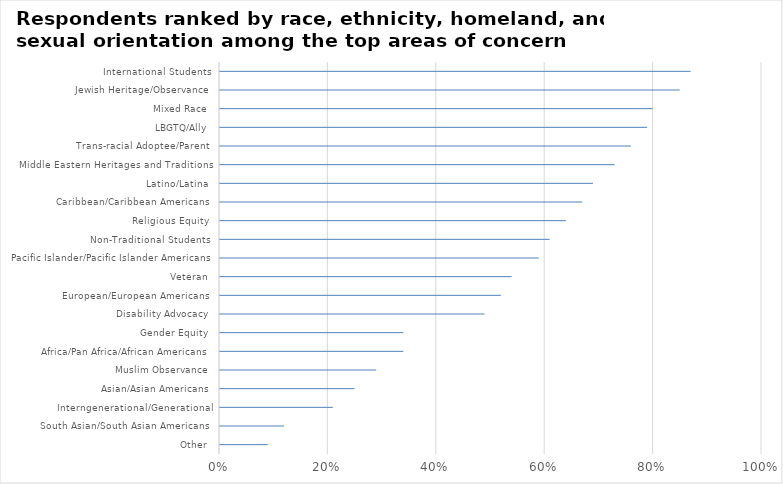
| Category | Series 0 |
|---|---|
| Other | 0.09 |
| South Asian/South Asian Americans | 0.12 |
| Interngenerational/Generational | 0.21 |
| Asian/Asian Americans | 0.25 |
| Muslim Observance | 0.29 |
| Africa/Pan Africa/African Americans | 0.34 |
| Gender Equity | 0.34 |
| Disability Advocacy | 0.49 |
| European/European Americans | 0.52 |
| Veteran | 0.54 |
| Pacific Islander/Pacific Islander Americans | 0.59 |
| Non-Traditional Students | 0.61 |
| Religious Equity | 0.64 |
| Caribbean/Caribbean Americans | 0.67 |
| Latino/Latina | 0.69 |
| Middle Eastern Heritages and Traditions | 0.73 |
| Trans-racial Adoptee/Parent | 0.76 |
| LBGTQ/Ally | 0.79 |
| Mixed Race | 0.8 |
| Jewish Heritage/Observance | 0.85 |
| International Students | 0.87 |